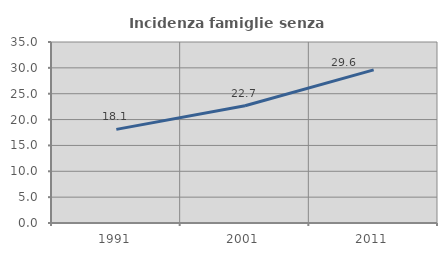
| Category | Incidenza famiglie senza nuclei |
|---|---|
| 1991.0 | 18.1 |
| 2001.0 | 22.665 |
| 2011.0 | 29.604 |